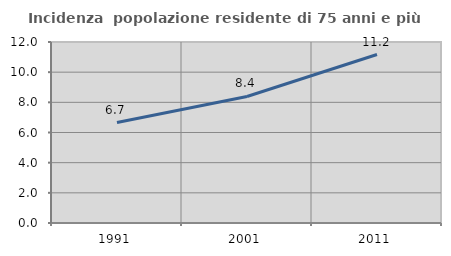
| Category | Incidenza  popolazione residente di 75 anni e più |
|---|---|
| 1991.0 | 6.659 |
| 2001.0 | 8.387 |
| 2011.0 | 11.169 |